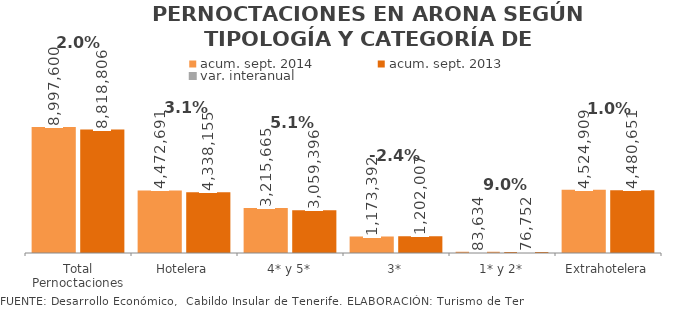
| Category | acum. sept. 2014 | acum. sept. 2013 |
|---|---|---|
| Total Pernoctaciones | 8997600 | 8818806 |
| Hotelera | 4472691 | 4338155 |
| 4* y 5* | 3215665 | 3059396 |
| 3* | 1173392 | 1202007 |
| 1* y 2* | 83634 | 76752 |
| Extrahotelera | 4524909 | 4480651 |